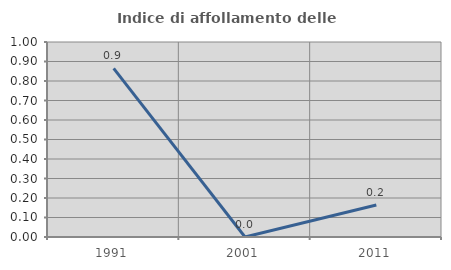
| Category | Indice di affollamento delle abitazioni  |
|---|---|
| 1991.0 | 0.865 |
| 2001.0 | 0 |
| 2011.0 | 0.164 |